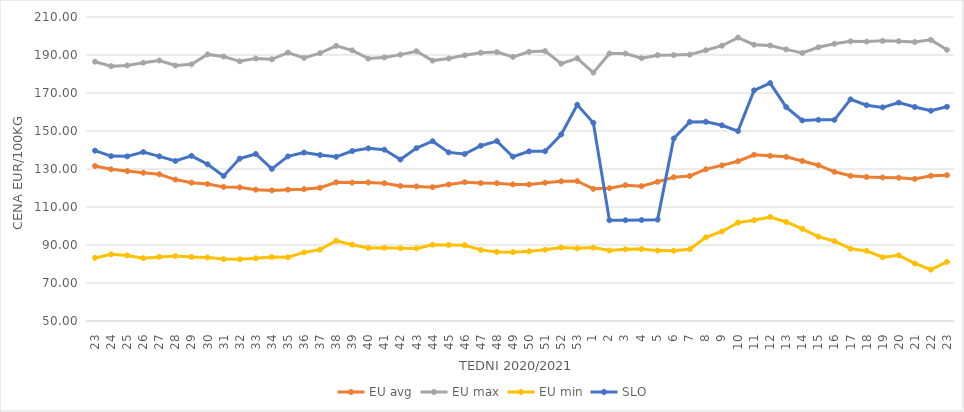
| Category | EU avg | EU max | EU min | SLO |
|---|---|---|---|---|
| 23.0 | 131.578 | 186.47 | 83.199 | 139.64 |
| 24.0 | 129.861 | 184.13 | 85.09 | 136.79 |
| 25.0 | 128.899 | 184.51 | 84.52 | 136.65 |
| 26.0 | 128.034 | 185.91 | 83.06 | 138.92 |
| 27.0 | 127.242 | 187.11 | 83.73 | 136.67 |
| 28.0 | 124.426 | 184.46 | 84.2 | 134.25 |
| 29.0 | 122.822 | 185.09 | 83.72 | 136.94 |
| 30.0 | 122.086 | 190.31 | 83.4 | 132.48 |
| 31.0 | 120.581 | 189.19 | 82.63 | 126.34 |
| 32.0 | 120.341 | 186.67 | 82.46 | 135.48 |
| 33.0 | 119.127 | 188.18 | 82.99 | 137.89 |
| 34.0 | 118.75 | 187.74 | 83.66 | 130.07 |
| 35.0 | 119.136 | 191.25 | 83.53 | 136.63 |
| 36.0 | 119.398 | 188.47 | 86.09 | 138.64 |
| 37.0 | 120.135 | 190.99 | 87.57 | 137.35 |
| 38.0 | 122.982 | 194.8 | 92.21 | 136.42 |
| 39.0 | 122.832 | 192.45 | 90.16 | 139.46 |
| 40.0 | 122.936 | 188.11 | 88.45 | 140.87 |
| 41.0 | 122.507 | 188.73 | 88.54 | 140.18 |
| 42.0 | 121.098 | 190.2 | 88.3 | 134.98 |
| 43.0 | 120.822 | 191.99 | 88.22 | 141 |
| 44.0 | 120.448 | 187.06 | 90.13 | 144.61 |
| 45.0 | 121.843 | 188.15 | 90.04 | 138.73 |
| 46.0 | 123.07 | 189.82 | 89.89 | 137.88 |
| 47.0 | 122.58 | 191.22 | 87.43 | 142.27 |
| 48.0 | 122.553 | 191.52 | 86.35 | 144.69 |
| 49.0 | 121.893 | 188.97 | 86.24 | 136.47 |
| 50.0 | 121.851 | 191.67 | 86.72 | 139.29 |
| 51.0 | 122.8 | 192.06 | 87.5 | 139.35 |
| 52.0 | 123.52 | 185.468 | 88.67 | 148.16 |
| 53.0 | 123.611 | 188.25 | 88.23 | 163.81 |
| 1.0 | 119.553 | 180.72 | 88.64 | 154.31 |
| 2.0 | 119.893 | 190.77 | 87.1 | 103.02 |
| 3.0 | 121.489 | 190.76 | 87.7 | 103.03 |
| 4.0 | 120.954 | 188.33 | 87.88 | 103.15 |
| 5.0 | 123.293 | 189.91 | 87.04 | 103.34 |
| 6.0 | 125.679 | 189.94 | 86.97 | 146.03 |
| 7.0 | 126.33 | 190.21 | 87.79 | 154.77 |
| 8.0 | 129.933 | 192.48 | 94.02 | 154.86 |
| 9.0 | 131.908 | 194.884 | 97.12 | 153 |
| 10.0 | 134.098 | 199.17 | 101.79 | 149.98 |
| 11.0 | 137.49 | 195.419 | 103.05 | 171.4 |
| 12.0 | 136.929 | 195.013 | 104.76 | 175.2 |
| 13.0 | 136.39 | 192.952 | 102.11 | 162.57 |
| 14.0 | 134.198 | 191.034 | 98.5 | 155.55 |
| 15.0 | 132.003 | 194.047 | 94.39 | 155.88 |
| 16.0 | 128.53 | 195.913 | 92.04 | 155.88 |
| 17.0 | 126.415 | 197.188 | 88.07 | 166.66 |
| 18.0 | 125.787 | 197.055 | 86.89 | 163.58 |
| 19.0 | 125.54 | 197.478 | 83.546 | 162.44 |
| 20.0 | 125.412 | 197.263 | 84.55 | 164.94 |
| 21.0 | 124.768 | 196.821 | 80.264 | 162.64 |
| 22.0 | 126.43 | 197.963 | 77.048 | 160.68 |
| 23.0 | 126.76 | 192.72 | 81.087 | 162.75 |